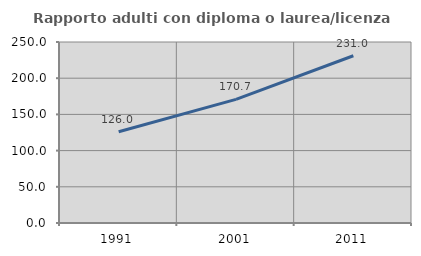
| Category | Rapporto adulti con diploma o laurea/licenza media  |
|---|---|
| 1991.0 | 126.017 |
| 2001.0 | 170.74 |
| 2011.0 | 231.011 |